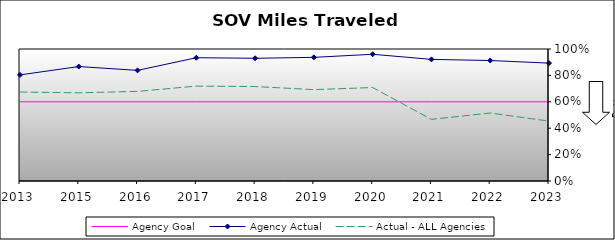
| Category | Agency Goal | Agency Actual | Actual - ALL Agencies |
|---|---|---|---|
| 2013.0 | 0.6 | 0.804 | 0.674 |
| 2015.0 | 0.6 | 0.867 | 0.668 |
| 2016.0 | 0.6 | 0.838 | 0.679 |
| 2017.0 | 0.6 | 0.934 | 0.719 |
| 2018.0 | 0.6 | 0.93 | 0.715 |
| 2019.0 | 0.6 | 0.937 | 0.692 |
| 2020.0 | 0.6 | 0.96 | 0.708 |
| 2021.0 | 0.6 | 0.921 | 0.467 |
| 2022.0 | 0.6 | 0.913 | 0.515 |
| 2023.0 | 0.6 | 0.893 | 0.454 |